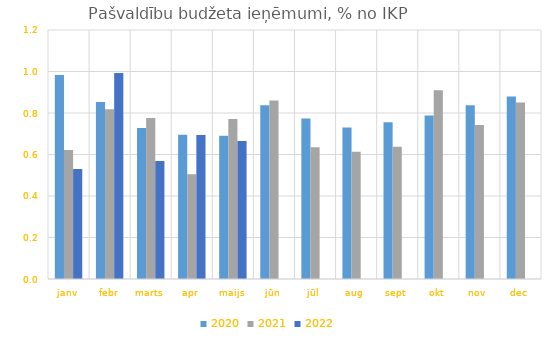
| Category | 2020 | 2021 | 2022 |
|---|---|---|---|
| janv | 0.983 | 0.621 | 0.53 |
| febr | 0.853 | 0.818 | 0.992 |
| marts | 0.727 | 0.776 | 0.568 |
| apr | 0.695 | 0.504 | 0.694 |
| maijs | 0.69 | 0.771 | 0.665 |
| jūn | 0.838 | 0.86 | 0 |
| jūl | 0.773 | 0.635 | 0 |
| aug | 0.73 | 0.613 | 0 |
| sept | 0.756 | 0.637 | 0 |
| okt | 0.788 | 0.91 | 0 |
| nov | 0.838 | 0.742 | 0 |
| dec | 0.88 | 0.85 | 0 |